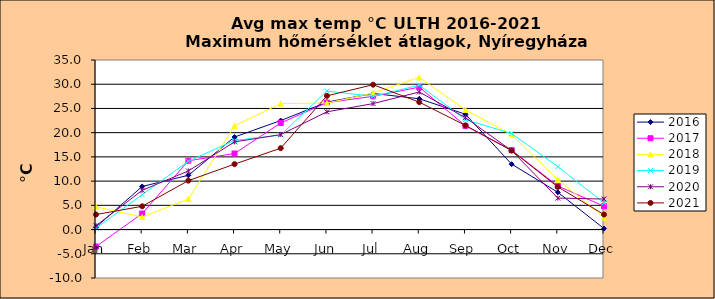
| Category | 2016 | 2017 | 2018 | 2019 | 2020 | 2021 |
|---|---|---|---|---|---|---|
| Jan | 0.5 | -3.5 | 4.7 | 0.3 | 0.8 | 3.1 |
| Feb | 8.9 | 3.3 | 2.6 | 7.2 | 8.1 | 4.8 |
| Mar | 11.2 | 14.2 | 6.3 | 14.1 | 12.1 | 10.1 |
| Apr | 19.1 | 15.7 | 21.4 | 18.4 | 18.1 | 13.5 |
| May | 22.5 | 22 | 26 | 19.5 | 19.6 | 16.8 |
| Jun | 26.3 | 26.2 | 26.1 | 28.6 | 24.3 | 27.6 |
| Jul | 28.1 | 27.5 | 28.2 | 27.5 | 26 | 29.9 |
| Aug | 27 | 29.4 | 31.4 | 29.8 | 28.4 | 26.3 |
| Sep | 23.8 | 21.4 | 24.7 | 22.7 | 23.1 | 21.5 |
| Oct | 13.5 | 16.4 | 19.6 | 19.8 | 16.3 | 16.3 |
| Nov | 7.7 | 9 | 10.3 | 13 | 6.5 | 8.8 |
| Dec | 0.2 | 4.8 | 2.5 | 5.5 | 6.3 | 3.1 |